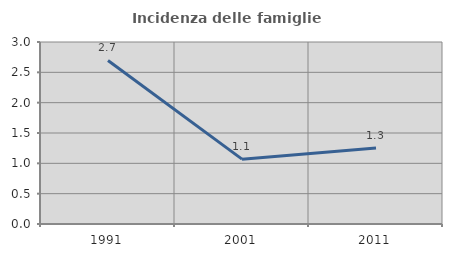
| Category | Incidenza delle famiglie numerose |
|---|---|
| 1991.0 | 2.696 |
| 2001.0 | 1.069 |
| 2011.0 | 1.251 |